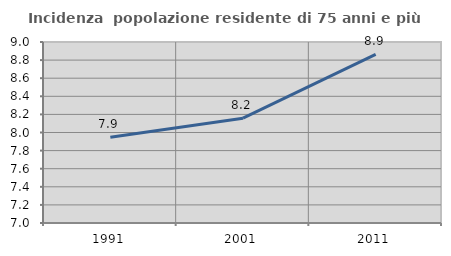
| Category | Incidenza  popolazione residente di 75 anni e più |
|---|---|
| 1991.0 | 7.947 |
| 2001.0 | 8.159 |
| 2011.0 | 8.864 |